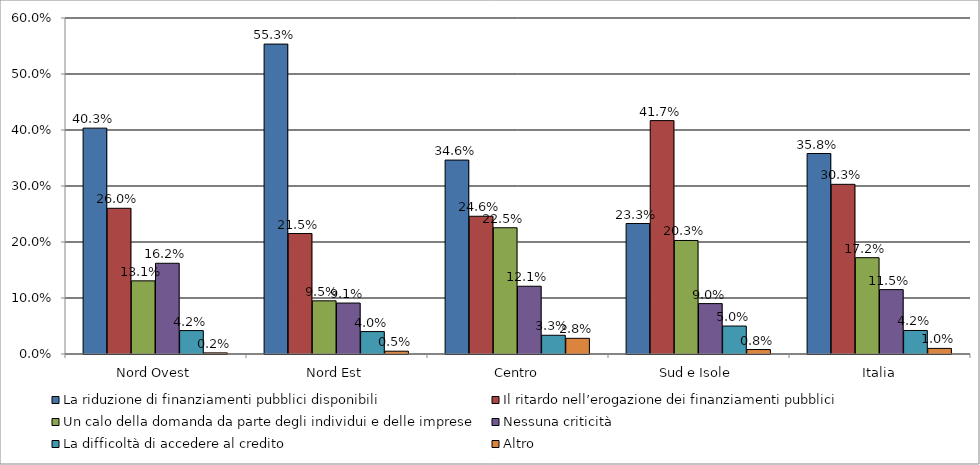
| Category | La riduzione di finanziamenti pubblici disponibili | Il ritardo nell’erogazione dei finanziamenti pubblici | Un calo della domanda da parte degli individui e delle imprese | Nessuna criticità | La difficoltà di accedere al credito | Altro |
|---|---|---|---|---|---|---|
| Nord Ovest | 0.403 | 0.26 | 0.131 | 0.162 | 0.042 | 0.002 |
| Nord Est | 0.553 | 0.215 | 0.095 | 0.091 | 0.04 | 0.005 |
| Centro | 0.346 | 0.246 | 0.225 | 0.121 | 0.033 | 0.028 |
| Sud e Isole | 0.233 | 0.417 | 0.203 | 0.09 | 0.05 | 0.008 |
| Italia | 0.358 | 0.303 | 0.172 | 0.115 | 0.042 | 0.01 |